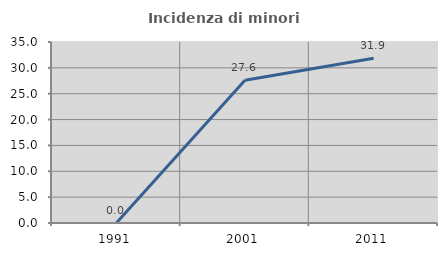
| Category | Incidenza di minori stranieri |
|---|---|
| 1991.0 | 0 |
| 2001.0 | 27.586 |
| 2011.0 | 31.868 |